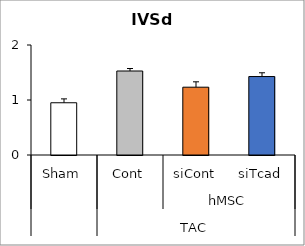
| Category | Series 0 |
|---|---|
| 0 | 0.95 |
| 1 | 1.527 |
| 2 | 1.233 |
| 3 | 1.427 |